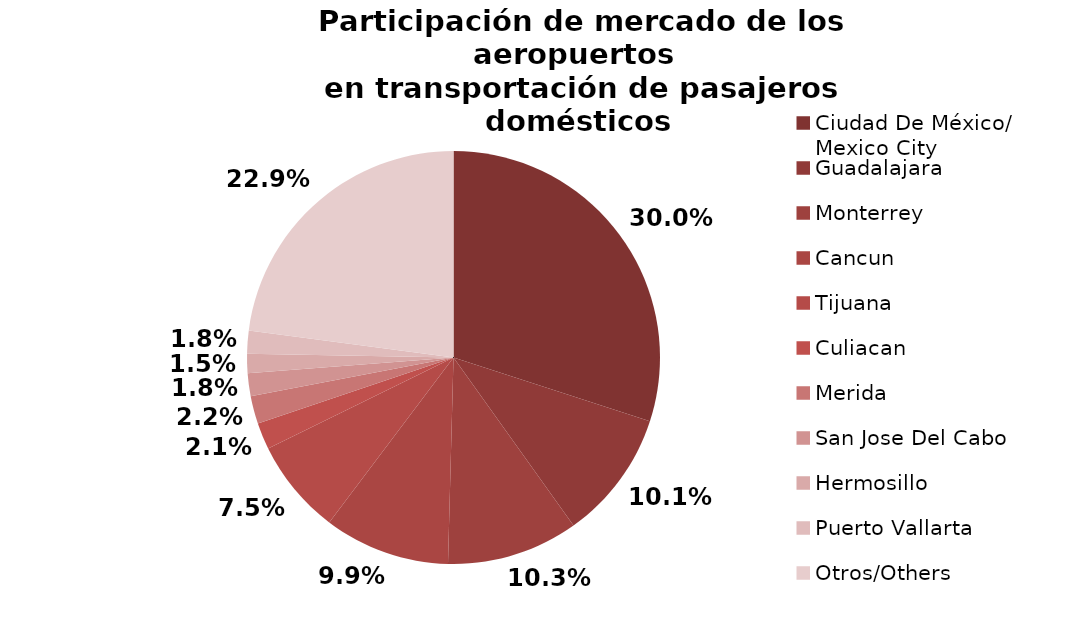
| Category | Series 0 |
|---|---|
| Ciudad De México/
Mexico City | 2652.795 |
| Guadalajara | 896.386 |
| Monterrey | 910.634 |
| Cancun | 871.321 |
| Tijuana | 659.659 |
| Culiacan | 183.958 |
| Merida | 192.64 |
| San Jose Del Cabo | 159.117 |
| Hermosillo | 133.088 |
| Puerto Vallarta | 159.165 |
| Otros/Others | 2025.676 |